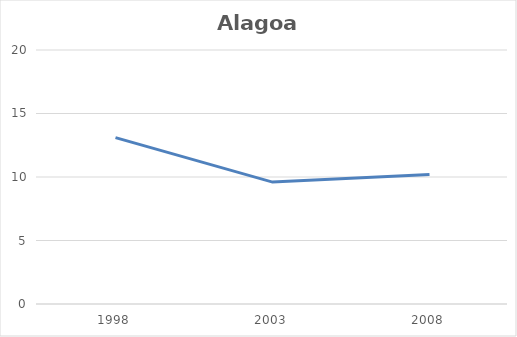
| Category | Alagoas |
|---|---|
| 1998.0 | 13.1 |
| 2003.0 | 9.6 |
| 2008.0 | 10.2 |